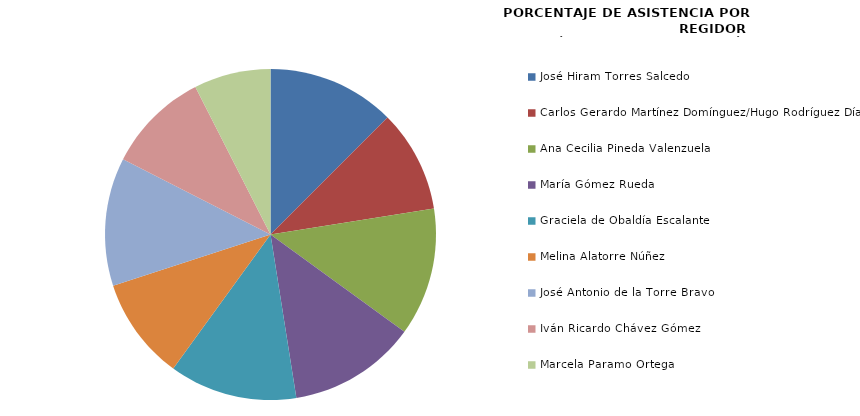
| Category | Series 0 |
|---|---|
| José Hiram Torres Salcedo | 100 |
| Carlos Gerardo Martínez Domínguez/Hugo Rodríguez Díaz | 80 |
| Ana Cecilia Pineda Valenzuela | 100 |
| María Gómez Rueda | 100 |
| Graciela de Obaldía Escalante | 100 |
| Melina Alatorre Núñez | 80 |
| José Antonio de la Torre Bravo | 100 |
| Iván Ricardo Chávez Gómez | 80 |
| Marcela Paramo Ortega | 60 |